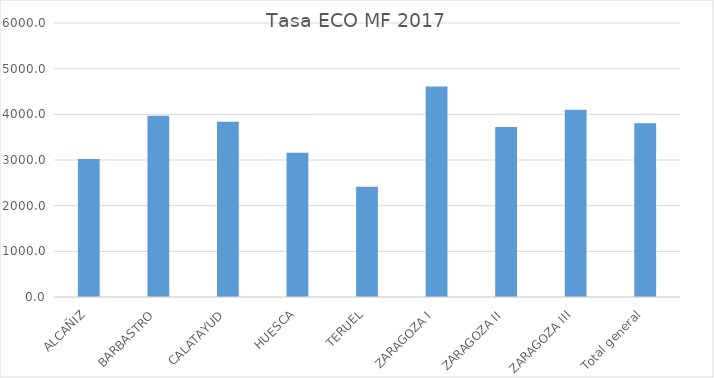
| Category | Series 0 |
|---|---|
| ALCAÑIZ | 3023.359 |
| BARBASTRO | 3970.624 |
| CALATAYUD | 3836.83 |
| HUESCA | 3156.768 |
| TERUEL | 2415.377 |
| ZARAGOZA I | 4608.535 |
| ZARAGOZA II | 3725.301 |
| ZARAGOZA III | 4098.646 |
| Total general | 3805.35 |